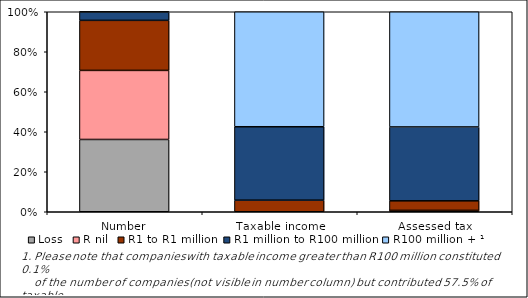
| Category | Loss | R nil | R1 to R1 million | R1 million to R100 million | R100 million + ¹ |
|---|---|---|---|---|---|
| Number | 36.145 | 34.531 | 25.023 | 4.219 | 0.082 |
| Taxable income | 0 | 0 | 5.796 | 36.708 | 57.496 |
| Assessed tax | 0.657 | 0.03 | 4.775 | 36.939 | 57.598 |